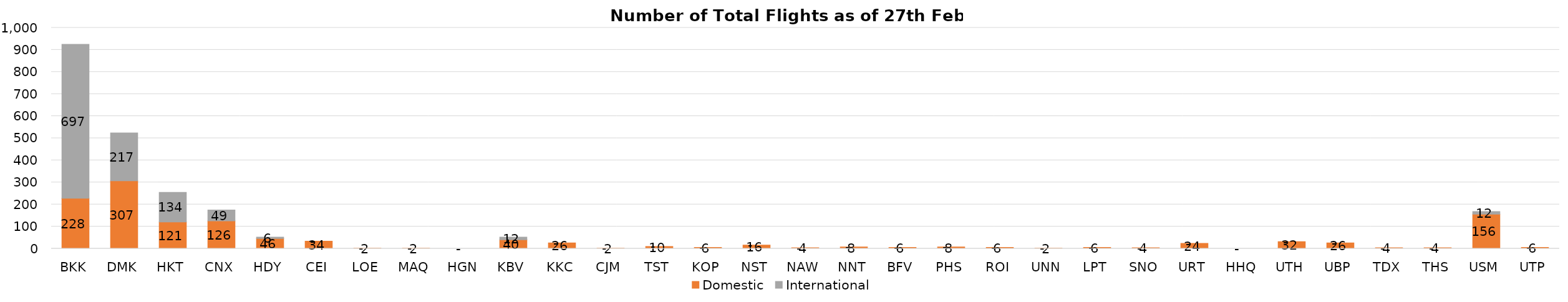
| Category | Domestic | International |
|---|---|---|
| BKK | 228 | 697 |
| DMK | 307 | 217 |
| HKT | 121 | 134 |
| CNX | 126 | 49 |
| HDY | 46 | 6 |
| CEI | 34 | 0 |
| LOE | 2 | 0 |
| MAQ | 2 | 0 |
| HGN | 0 | 0 |
| KBV | 40 | 12 |
| KKC | 26 | 0 |
| CJM | 2 | 0 |
| TST | 10 | 0 |
| KOP | 6 | 0 |
| NST | 16 | 0 |
| NAW | 4 | 0 |
| NNT | 8 | 0 |
| BFV | 6 | 0 |
| PHS | 8 | 0 |
| ROI | 6 | 0 |
| UNN | 2 | 0 |
| LPT | 6 | 0 |
| SNO | 4 | 0 |
| URT | 24 | 0 |
| HHQ | 0 | 0 |
| UTH | 32 | 0 |
| UBP | 26 | 0 |
| TDX | 4 | 0 |
| THS | 4 | 0 |
| USM | 156 | 12 |
| UTP | 6 | 0 |